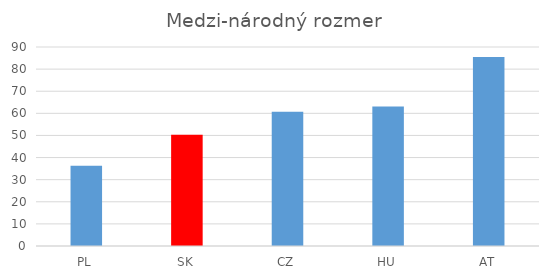
| Category | Medzi-národný rozmer |
|---|---|
| PL | 36.267 |
| SK | 50.367 |
| CZ | 60.733 |
| HU | 63.1 |
| AT | 85.5 |